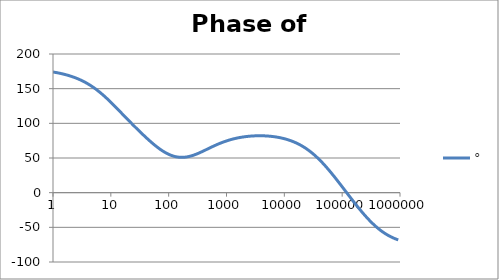
| Category | ° |
|---|---|
| 1.0 | 174.048 |
| 1.0715193052376064 | 173.625 |
| 1.1481536214968828 | 173.172 |
| 1.2302687708123814 | 172.687 |
| 1.318256738556407 | 172.168 |
| 1.4125375446227544 | 171.613 |
| 1.513561248436208 | 171.02 |
| 1.6218100973589298 | 170.385 |
| 1.7378008287493754 | 169.707 |
| 1.8620871366628673 | 168.983 |
| 1.9952623149688797 | 168.21 |
| 2.1379620895022318 | 167.384 |
| 2.2908676527677727 | 166.504 |
| 2.45470891568503 | 165.565 |
| 2.6302679918953817 | 164.565 |
| 2.8183829312644537 | 163.501 |
| 3.0199517204020156 | 162.369 |
| 3.235936569296282 | 161.166 |
| 3.467368504525316 | 159.89 |
| 3.7153522909717256 | 158.538 |
| 3.9810717055349727 | 157.107 |
| 4.265795188015926 | 155.595 |
| 4.570881896148749 | 154.001 |
| 4.897788193684462 | 152.323 |
| 5.2480746024977245 | 150.561 |
| 5.62341325190349 | 148.714 |
| 6.025595860743575 | 146.783 |
| 6.456542290346554 | 144.771 |
| 6.918309709189363 | 142.68 |
| 7.4131024130091765 | 140.513 |
| 7.943282347242814 | 138.275 |
| 8.511380382023765 | 135.971 |
| 9.120108393559095 | 133.606 |
| 9.772372209558105 | 131.189 |
| 10.47128548050899 | 128.725 |
| 11.22018454301963 | 126.223 |
| 12.022644346174127 | 123.69 |
| 12.88249551693134 | 121.133 |
| 13.803842646028851 | 118.56 |
| 14.791083881682074 | 115.977 |
| 15.848931924611136 | 113.39 |
| 16.98243652461744 | 110.806 |
| 18.197008586099834 | 108.227 |
| 19.498445997580447 | 105.659 |
| 20.892961308540382 | 103.103 |
| 22.387211385683386 | 100.564 |
| 23.988329190194897 | 98.042 |
| 25.703957827688622 | 95.539 |
| 27.54228703338165 | 93.056 |
| 29.51209226666385 | 90.595 |
| 31.62277660168379 | 88.157 |
| 33.884415613920254 | 85.745 |
| 36.307805477010106 | 83.36 |
| 38.90451449942804 | 81.006 |
| 41.686938347033525 | 78.687 |
| 44.6683592150963 | 76.408 |
| 47.86300923226381 | 74.175 |
| 51.28613839913647 | 71.994 |
| 54.95408738576247 | 69.874 |
| 58.88436553555889 | 67.822 |
| 63.09573444801931 | 65.847 |
| 67.60829753919813 | 63.959 |
| 72.44359600749901 | 62.168 |
| 77.62471166286915 | 60.482 |
| 83.17637711026705 | 58.911 |
| 89.12509381337456 | 57.464 |
| 95.49925860214357 | 56.148 |
| 102.32929922807544 | 54.97 |
| 109.64781961431841 | 53.937 |
| 117.48975549395293 | 53.053 |
| 125.89254117941665 | 52.322 |
| 134.89628825916537 | 51.746 |
| 144.54397707459273 | 51.326 |
| 154.88166189124806 | 51.062 |
| 165.95869074375608 | 50.952 |
| 177.82794100389225 | 50.993 |
| 190.5460717963248 | 51.181 |
| 204.17379446695278 | 51.509 |
| 218.77616239495524 | 51.97 |
| 234.42288153199212 | 52.557 |
| 251.18864315095806 | 53.26 |
| 269.15348039269156 | 54.068 |
| 288.4031503126605 | 54.971 |
| 309.0295432513591 | 55.956 |
| 331.1311214825911 | 57.01 |
| 354.81338923357566 | 58.122 |
| 380.18939632056095 | 59.278 |
| 407.3802778041123 | 60.466 |
| 436.5158322401654 | 61.674 |
| 467.7351412871979 | 62.891 |
| 501.18723362727184 | 64.107 |
| 537.0317963702526 | 65.311 |
| 575.4399373371566 | 66.497 |
| 616.5950018614822 | 67.656 |
| 660.6934480075952 | 68.782 |
| 707.9457843841375 | 69.87 |
| 758.5775750291831 | 70.917 |
| 812.8305161640983 | 71.918 |
| 870.9635899560801 | 72.872 |
| 933.2543007969903 | 73.776 |
| 999.9999999999998 | 74.631 |
| 1071.5193052376057 | 75.435 |
| 1148.1536214968828 | 76.188 |
| 1230.2687708123801 | 76.892 |
| 1318.2567385564053 | 77.546 |
| 1412.537544622753 | 78.151 |
| 1513.5612484362066 | 78.708 |
| 1621.8100973589292 | 79.219 |
| 1737.8008287493742 | 79.685 |
| 1862.0871366628671 | 80.106 |
| 1995.2623149688786 | 80.484 |
| 2137.9620895022326 | 80.82 |
| 2290.867652767771 | 81.114 |
| 2454.708915685027 | 81.368 |
| 2630.26799189538 | 81.583 |
| 2818.382931264451 | 81.758 |
| 3019.9517204020176 | 81.895 |
| 3235.9365692962774 | 81.995 |
| 3467.368504525316 | 82.056 |
| 3715.352290971724 | 82.079 |
| 3981.07170553497 | 82.065 |
| 4265.795188015923 | 82.013 |
| 4570.881896148745 | 81.922 |
| 4897.788193684463 | 81.791 |
| 5248.074602497726 | 81.621 |
| 5623.413251903489 | 81.409 |
| 6025.595860743574 | 81.155 |
| 6456.54229034655 | 80.858 |
| 6918.309709189357 | 80.514 |
| 7413.102413009165 | 80.123 |
| 7943.282347242815 | 79.682 |
| 8511.380382023763 | 79.189 |
| 9120.108393559092 | 78.641 |
| 9772.3722095581 | 78.036 |
| 10471.285480509003 | 77.37 |
| 11220.184543019639 | 76.64 |
| 12022.64434617411 | 75.843 |
| 12882.495516931338 | 74.976 |
| 13803.842646028841 | 74.034 |
| 14791.083881682063 | 73.016 |
| 15848.931924611119 | 71.915 |
| 16982.436524617453 | 70.731 |
| 18197.008586099837 | 69.458 |
| 19498.445997580417 | 68.093 |
| 20892.961308540387 | 66.635 |
| 22387.211385683382 | 65.079 |
| 23988.32919019488 | 63.423 |
| 25703.957827688606 | 61.664 |
| 27542.28703338167 | 59.802 |
| 29512.092266663854 | 57.836 |
| 31622.77660168378 | 55.763 |
| 33884.41561392023 | 53.585 |
| 36307.805477010166 | 51.302 |
| 38904.514499428085 | 48.915 |
| 41686.93834703348 | 46.429 |
| 44668.35921509631 | 43.844 |
| 47863.00923226382 | 41.167 |
| 51286.13839913646 | 38.402 |
| 54954.08738576241 | 35.554 |
| 58884.365535558936 | 32.631 |
| 63095.73444801934 | 29.639 |
| 67608.29753919817 | 26.586 |
| 72443.59600749899 | 23.479 |
| 77624.71166286913 | 20.326 |
| 83176.37711026703 | 17.135 |
| 89125.09381337445 | 13.913 |
| 95499.25860214363 | 10.666 |
| 102329.29922807543 | 7.404 |
| 109647.81961431848 | 4.131 |
| 117489.75549395289 | 0.855 |
| 125892.54117941685 | -2.418 |
| 134896.28825916522 | -5.681 |
| 144543.97707459255 | -8.927 |
| 154881.66189124787 | -12.15 |
| 165958.69074375575 | -15.343 |
| 177827.9410038922 | -18.497 |
| 190546.07179632425 | -21.607 |
| 204173.79446695274 | -24.663 |
| 218776.16239495497 | -27.659 |
| 234422.88153199226 | -30.586 |
| 251188.64315095753 | -33.437 |
| 269153.480392691 | -36.205 |
| 288403.15031266044 | -38.884 |
| 309029.5432513582 | -41.467 |
| 331131.1214825907 | -43.949 |
| 354813.3892335749 | -46.326 |
| 380189.3963205612 | -48.594 |
| 407380.2778041119 | -50.751 |
| 436515.8322401649 | -52.796 |
| 467735.14128719777 | -54.728 |
| 501187.2336272717 | -56.546 |
| 537031.7963702519 | -58.251 |
| 575439.9373371559 | -59.846 |
| 616595.001861482 | -61.331 |
| 660693.4480075944 | -62.71 |
| 707945.7843841374 | -63.984 |
| 758577.575029183 | -65.158 |
| 812830.5161640996 | -66.234 |
| 870963.5899560791 | -67.217 |
| 933254.3007969892 | -68.11 |